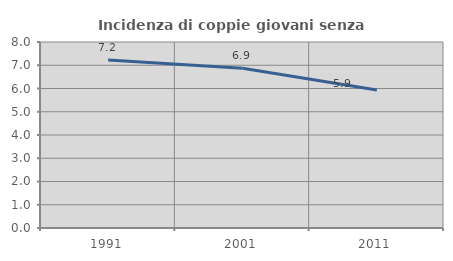
| Category | Incidenza di coppie giovani senza figli |
|---|---|
| 1991.0 | 7.222 |
| 2001.0 | 6.872 |
| 2011.0 | 5.935 |